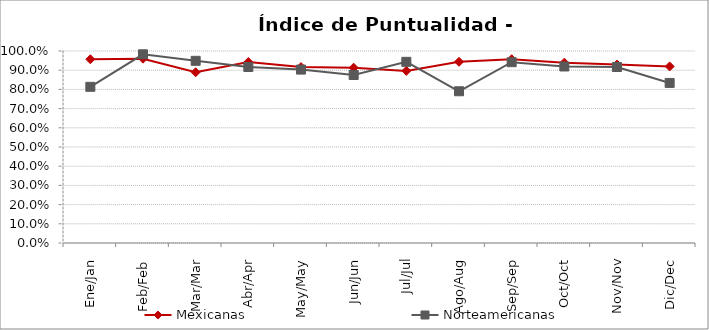
| Category | Mexicanas | Norteamericanas |
|---|---|---|
| Ene/Jan | 0.957 | 0.813 |
| Feb/Feb | 0.96 | 0.983 |
| Mar/Mar | 0.889 | 0.949 |
| Abr/Apr | 0.943 | 0.917 |
| May/May | 0.916 | 0.903 |
| Jun/Jun | 0.913 | 0.875 |
| Jul/Jul | 0.896 | 0.944 |
| Ago/Aug | 0.944 | 0.79 |
| Sep/Sep | 0.957 | 0.942 |
| Oct/Oct | 0.939 | 0.919 |
| Nov/Nov | 0.929 | 0.917 |
| Dic/Dec | 0.92 | 0.834 |